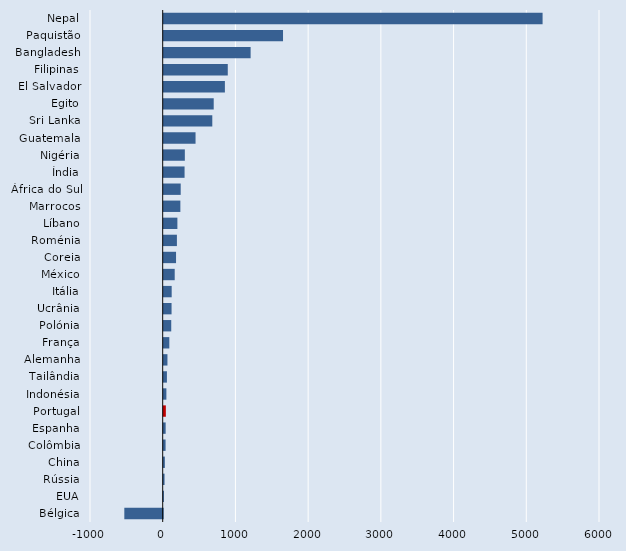
| Category | Series 2 |
|---|---|
| Nepal | 5210.448 |
| Paquistão | 1640.779 |
| Bangladesh | 1195.219 |
| Filipinas | 880.98 |
| El Salvador | 841.342 |
| Egito | 687.579 |
| Sri Lanka | 668.181 |
| Guatemala | 437.773 |
| Nigéria | 290.568 |
| Índia | 286.804 |
| África do Sul | 233.569 |
| Marrocos | 228.994 |
| Líbano | 188.094 |
| Roménia | 181.522 |
| Coreia | 169.514 |
| México | 151.203 |
| Itália | 109.571 |
| Ucrânia | 107.864 |
| Polónia | 103.492 |
| França | 77.078 |
| Alemanha | 51.297 |
| Tailândia | 44.094 |
| Indonésia | 36.763 |
| Portugal | 29.182 |
| Espanha | 26.639 |
| Colômbia | 25.68 |
| China | 15.473 |
| Rússia | 11.424 |
| EUA | 3.084 |
| Bélgica | -528.058 |